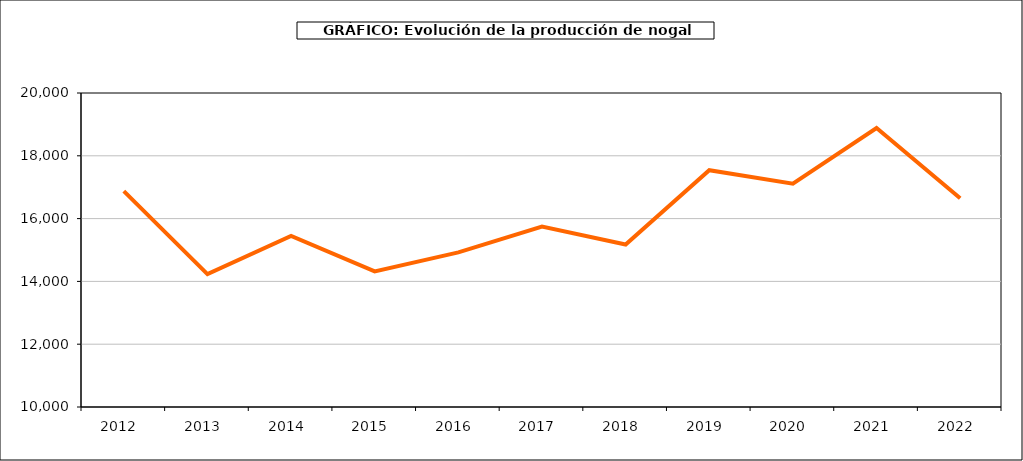
| Category | producción nogal |
|---|---|
| 2012.0 | 16877 |
| 2013.0 | 14230 |
| 2014.0 | 15450 |
| 2015.0 | 14319 |
| 2016.0 | 14923 |
| 2017.0 | 15744 |
| 2018.0 | 15176 |
| 2019.0 | 17542 |
| 2020.0 | 17114 |
| 2021.0 | 18883 |
| 2022.0 | 16650 |